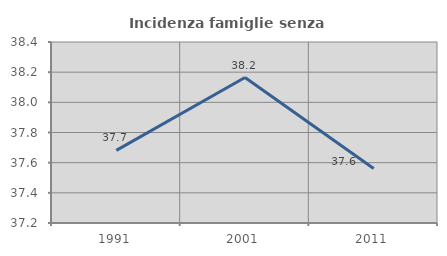
| Category | Incidenza famiglie senza nuclei |
|---|---|
| 1991.0 | 37.681 |
| 2001.0 | 38.164 |
| 2011.0 | 37.561 |